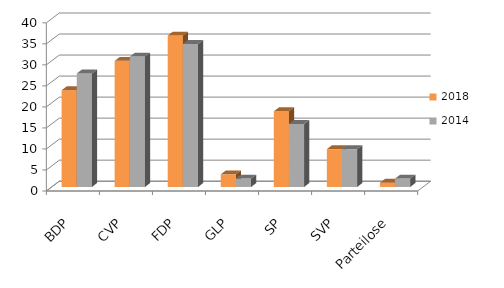
| Category | 2018 | 2014 |
|---|---|---|
| BDP | 23 | 27 |
| CVP | 30 | 31 |
| FDP | 36 | 34 |
| GLP | 3 | 2 |
| SP | 18 | 15 |
| SVP | 9 | 9 |
| Parteilose | 1 | 2 |